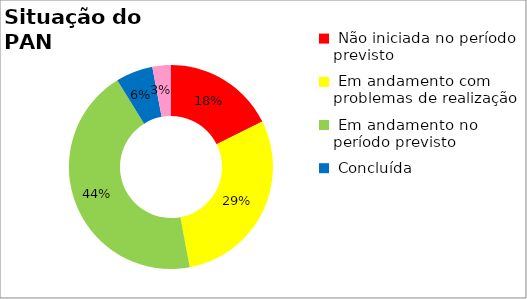
| Category | Series 0 |
|---|---|
|  Início planejado é posterior ao período monitorado | 0 |
|  Não iniciada no período previsto | 0.176 |
|  Em andamento com problemas de realização | 0.294 |
|  Em andamento no período previsto  | 0.441 |
|  Concluída | 0.059 |
|  Ações Novas - Pós monitoria | 0.029 |